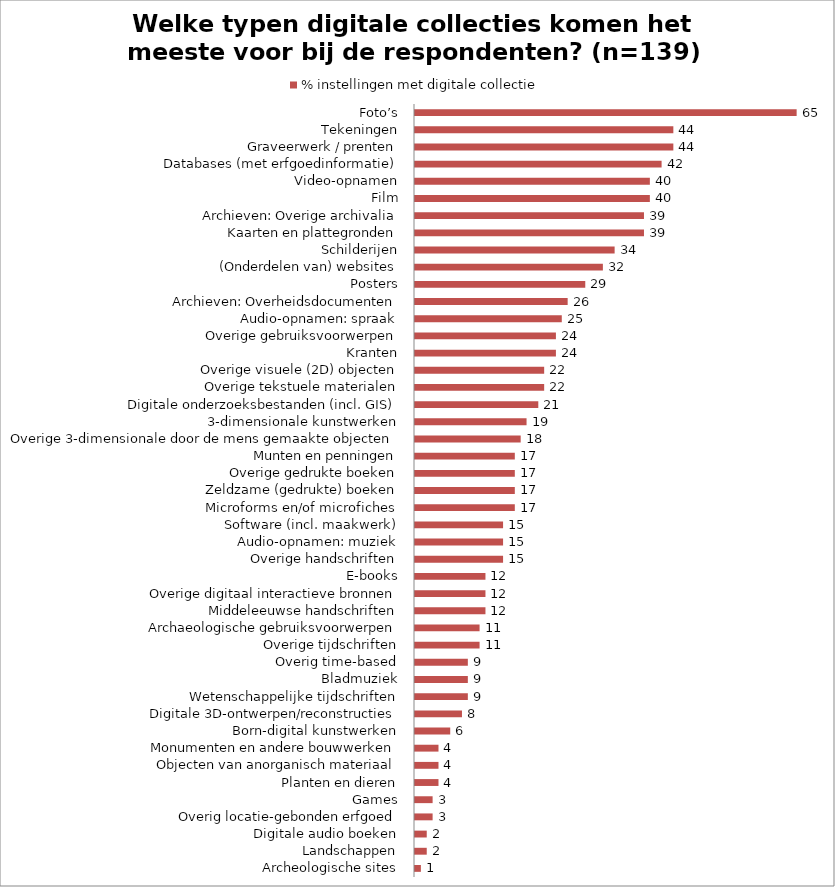
| Category | % instellingen met digitale collectie |
|---|---|
| Archeologische sites | 1 |
| Landschappen | 2 |
| Digitale audio boeken | 2 |
| Overig locatie-gebonden erfgoed | 3 |
| Games | 3 |
| Planten en dieren | 4 |
| Objecten van anorganisch materiaal | 4 |
| Monumenten en andere bouwwerken | 4 |
| Born-digital kunstwerken | 6 |
| Digitale 3D-ontwerpen/reconstructies | 8 |
| Wetenschappelijke tijdschriften | 9 |
| Bladmuziek | 9 |
| Overig time-based | 9 |
| Overige tijdschriften | 11 |
| Archaeologische gebruiksvoorwerpen | 11 |
| Middeleeuwse handschriften | 12 |
| Overige digitaal interactieve bronnen | 12 |
| E-books | 12 |
| Overige handschriften | 15 |
| Audio-opnamen: muziek | 15 |
| Software (incl. maakwerk) | 15 |
| Microforms en/of microfiches | 17 |
| Zeldzame (gedrukte) boeken | 17 |
| Overige gedrukte boeken | 17 |
| Munten en penningen | 17 |
| Overige 3-dimensionale door de mens gemaakte objecten | 18 |
| 3-dimensionale kunstwerken | 19 |
| Digitale onderzoeksbestanden (incl. GIS) | 21 |
| Overige tekstuele materialen | 22 |
| Overige visuele (2D) objecten | 22 |
| Kranten | 24 |
| Overige gebruiksvoorwerpen | 24 |
| Audio-opnamen: spraak | 25 |
| Archieven: Overheidsdocumenten | 26 |
| Posters | 29 |
| (Onderdelen van) websites | 32 |
| Schilderijen | 34 |
| Kaarten en plattegronden | 39 |
| Archieven: Overige archivalia | 39 |
| Film | 40 |
| Video-opnamen | 40 |
| Databases (met erfgoedinformatie) | 42 |
| Graveerwerk / prenten | 44 |
| Tekeningen | 44 |
| Foto’s | 65 |